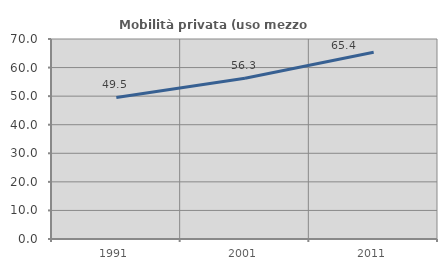
| Category | Mobilità privata (uso mezzo privato) |
|---|---|
| 1991.0 | 49.543 |
| 2001.0 | 56.272 |
| 2011.0 | 65.356 |